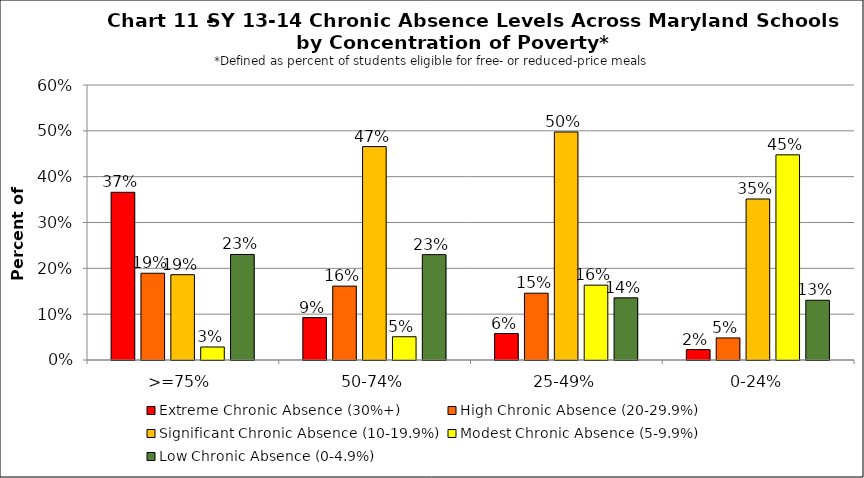
| Category | Extreme Chronic Absence (30%+) | High Chronic Absence (20-29.9%) | Significant Chronic Absence (10-19.9%) | Modest Chronic Absence (5-9.9%) | Low Chronic Absence (0-4.9%) |
|---|---|---|---|---|---|
| 0 | 0.366 | 0.189 | 0.186 | 0.028 | 0.23 |
| 1 | 0.093 | 0.161 | 0.466 | 0.051 | 0.23 |
| 2 | 0.058 | 0.146 | 0.497 | 0.163 | 0.136 |
| 3 | 0.023 | 0.048 | 0.351 | 0.448 | 0.13 |